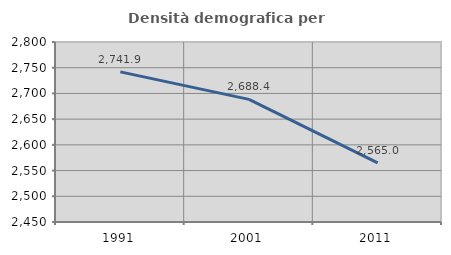
| Category | Densità demografica |
|---|---|
| 1991.0 | 2741.948 |
| 2001.0 | 2688.397 |
| 2011.0 | 2564.998 |